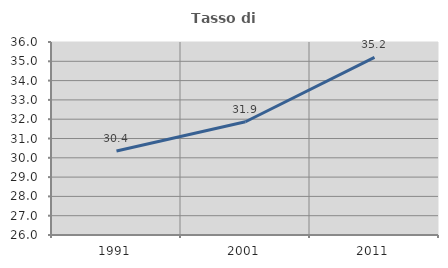
| Category | Tasso di occupazione   |
|---|---|
| 1991.0 | 30.356 |
| 2001.0 | 31.869 |
| 2011.0 | 35.203 |